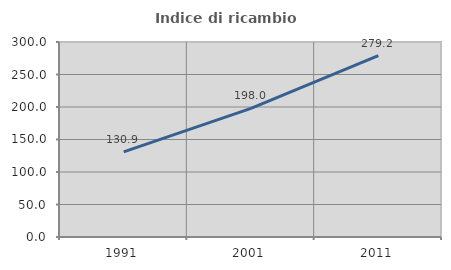
| Category | Indice di ricambio occupazionale  |
|---|---|
| 1991.0 | 130.851 |
| 2001.0 | 197.99 |
| 2011.0 | 279.167 |